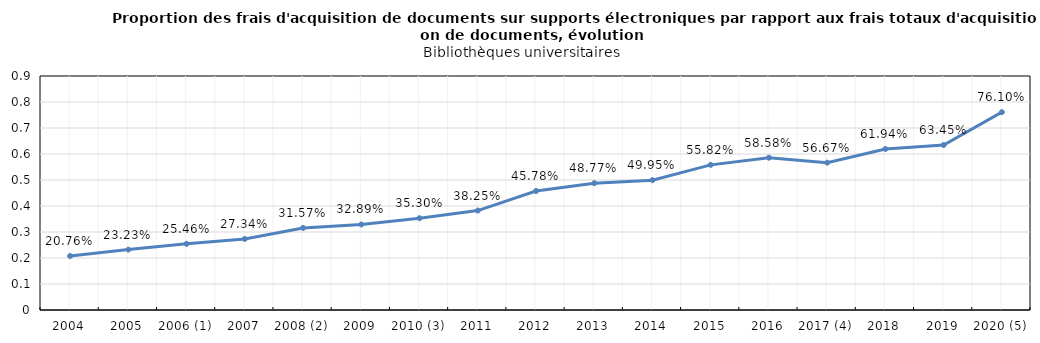
| Category | Series 0 |
|---|---|
| 2004 | 0.208 |
| 2005 | 0.232 |
| 2006 (1) | 0.255 |
| 2007 | 0.273 |
| 2008 (2) | 0.316 |
| 2009 | 0.329 |
| 2010 (3) | 0.353 |
| 2011 | 0.382 |
| 2012 | 0.458 |
| 2013 | 0.488 |
| 2014 | 0.499 |
| 2015 | 0.558 |
| 2016 | 0.586 |
| 2017 (4) | 0.567 |
| 2018 | 0.619 |
| 2019 | 0.635 |
| 2020 (5)  | 0.761 |